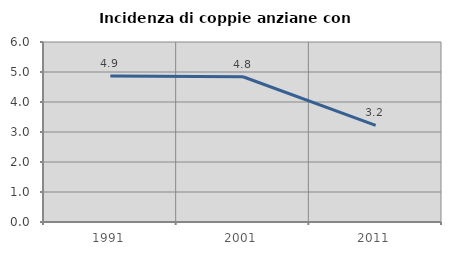
| Category | Incidenza di coppie anziane con figli |
|---|---|
| 1991.0 | 4.869 |
| 2001.0 | 4.841 |
| 2011.0 | 3.221 |